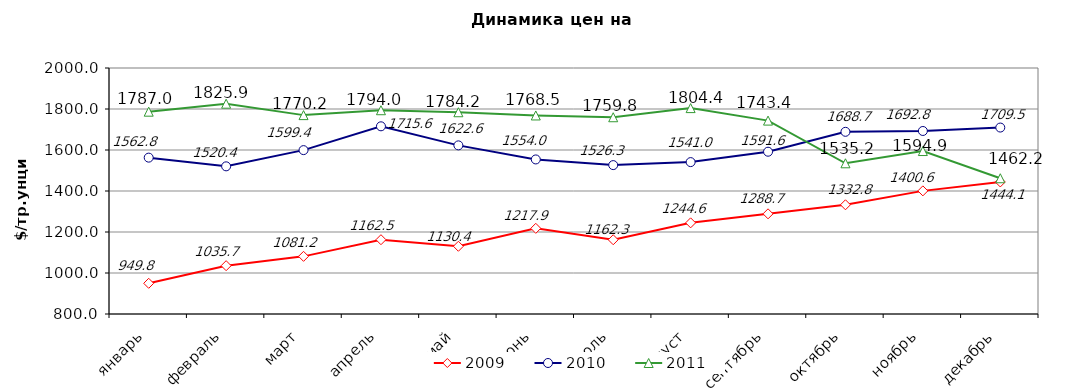
| Category | 2009 | 2010 | 2011 |
|---|---|---|---|
| январь | 949.762 | 1562.75 | 1786.95 |
| февраль | 1035.7 | 1520.35 | 1825.9 |
| март | 1081.182 | 1599.43 | 1770.17 |
| апрель | 1162.5 | 1715.55 | 1794 |
| май | 1130.368 | 1622.58 | 1784.15 |
| июнь | 1217.86 | 1553.95 | 1768.5 |
| июль | 1162.261 | 1526.32 | 1759.76 |
| август | 1244.6 | 1540.95 | 1804.36 |
| сентябрь | 1288.705 | 1591.61 | 1743.44 |
| октябрь | 1332.773 | 1688.69 | 1535.19 |
| ноябрь | 1400.619 | 1692.77 | 1594.93 |
| декабрь | 1444.095 | 1709.48 | 1462.2 |